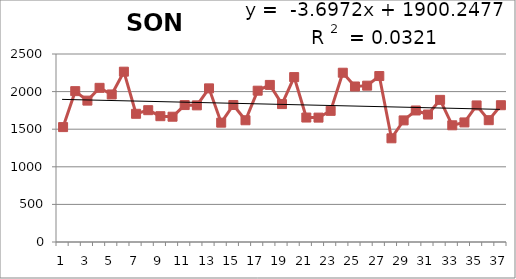
| Category | 1976-2012 |
|---|---|
| 0 | 1528 |
| 1 | 2006 |
| 2 | 1880 |
| 3 | 2050 |
| 4 | 1962 |
| 5 | 2265 |
| 6 | 1705 |
| 7 | 1753 |
| 8 | 1673 |
| 9 | 1666 |
| 10 | 1821 |
| 11 | 1817 |
| 12 | 2043 |
| 13 | 1587 |
| 14 | 1822 |
| 15 | 1619 |
| 16 | 2012 |
| 17 | 2089 |
| 18 | 1834 |
| 19 | 2193 |
| 20 | 1655 |
| 21 | 1654 |
| 22 | 1744 |
| 23 | 2251 |
| 24 | 2068 |
| 25 | 2079 |
| 26 | 2207 |
| 27 | 1379 |
| 28 | 1617 |
| 29 | 1749 |
| 30 | 1695 |
| 31 | 1890 |
| 32 | 1552 |
| 33 | 1590 |
| 34 | 1816 |
| 35 | 1620 |
| 36 | 1819 |